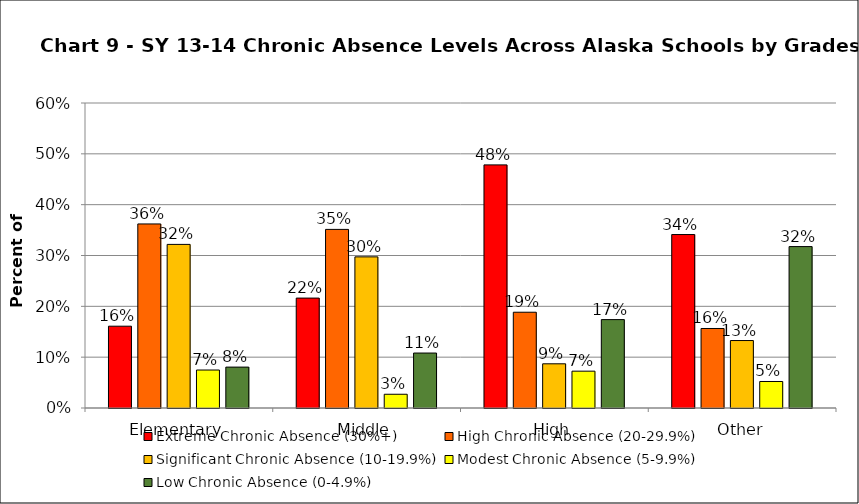
| Category | Extreme Chronic Absence (30%+) | High Chronic Absence (20-29.9%) | Significant Chronic Absence (10-19.9%) | Modest Chronic Absence (5-9.9%) | Low Chronic Absence (0-4.9%) |
|---|---|---|---|---|---|
| 0 | 0.161 | 0.362 | 0.322 | 0.075 | 0.08 |
| 1 | 0.216 | 0.351 | 0.297 | 0.027 | 0.108 |
| 2 | 0.478 | 0.188 | 0.087 | 0.072 | 0.174 |
| 3 | 0.341 | 0.156 | 0.133 | 0.052 | 0.318 |